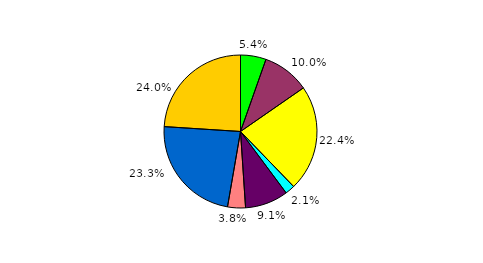
| Category | Series 0 |
|---|---|
| 0 | 5.399 |
| 1 | 9.957 |
| 2 | 22.418 |
| 3 | 2.053 |
| 4 | 9.115 |
| 5 | 3.777 |
| 6 | 23.301 |
| 7 | 23.979 |